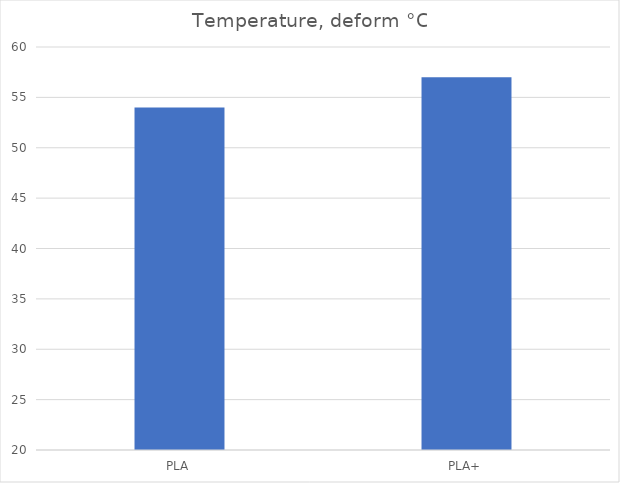
| Category | Deform °C |
|---|---|
| PLA | 54 |
| PLA+ | 57 |